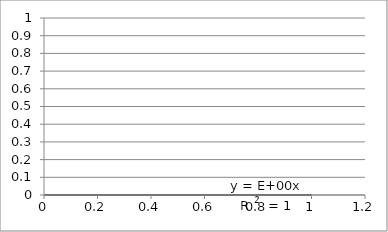
| Category | Series 0 |
|---|---|
| 1.0 | 0 |
| 0.6989700043360189 | 0 |
| 0.5228787452803376 | 0 |
| 0.3979400086720376 | 0 |
| 0.3010299956639812 | 0 |
| 0.2218487496163564 | 0 |
| 0.1549019599857432 | 0 |
| 0.09691001300805642 | 0 |
| 0.04575749056067514 | 0 |
| 0.0 | 0 |